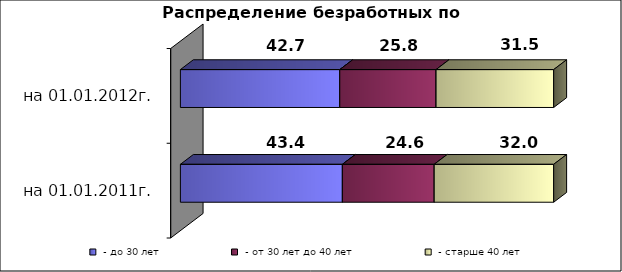
| Category |  - до 30 лет  |  - от 30 лет до 40 лет  |  - старше 40 лет  |
|---|---|---|---|
| на 01.01.2011г. | 43.4 | 24.6 | 32 |
| на 01.01.2012г. | 42.7 | 25.8 | 31.5 |